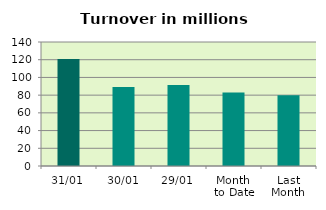
| Category | Series 0 |
|---|---|
| 31/01 | 120.81 |
| 30/01 | 89.164 |
| 29/01 | 91.505 |
| Month 
to Date | 82.868 |
| Last
Month | 79.992 |